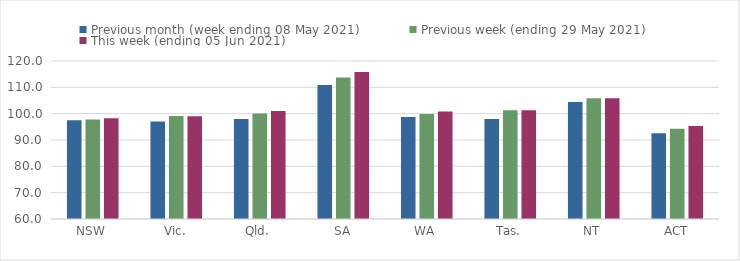
| Category | Previous month (week ending 08 May 2021) | Previous week (ending 29 May 2021) | This week (ending 05 Jun 2021) |
|---|---|---|---|
| NSW | 97.51 | 97.83 | 98.29 |
| Vic. | 97.03 | 99.08 | 99.02 |
| Qld. | 97.94 | 100.11 | 100.99 |
| SA | 110.9 | 113.78 | 115.8 |
| WA | 98.78 | 99.87 | 100.86 |
| Tas. | 97.94 | 101.26 | 101.26 |
| NT | 104.4 | 105.81 | 105.81 |
| ACT | 92.52 | 94.31 | 95.36 |